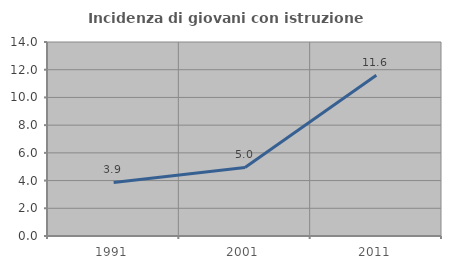
| Category | Incidenza di giovani con istruzione universitaria |
|---|---|
| 1991.0 | 3.867 |
| 2001.0 | 4.95 |
| 2011.0 | 11.597 |